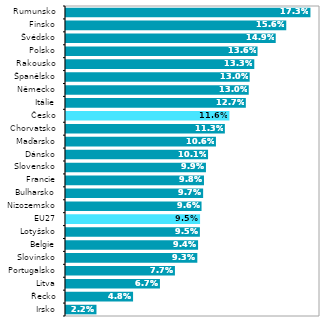
| Category | 2020* |
|---|---|
| Irsko | 0.022 |
| Řecko | 0.048 |
| Litva | 0.067 |
| Portugalsko | 0.077 |
| Slovinsko | 0.093 |
| Belgie | 0.094 |
| Lotyšsko | 0.095 |
| EU27 | 0.095 |
| Nizozemsko | 0.096 |
| Bulharsko | 0.097 |
| Francie | 0.098 |
| Slovensko | 0.099 |
| Dánsko | 0.101 |
| Maďarsko | 0.106 |
| Chorvatsko | 0.113 |
| Česko | 0.116 |
| Itálie | 0.127 |
| Německo | 0.13 |
| Španělsko | 0.13 |
| Rakousko | 0.133 |
| Polsko | 0.136 |
| Švédsko | 0.149 |
| Finsko | 0.156 |
| Rumunsko | 0.173 |